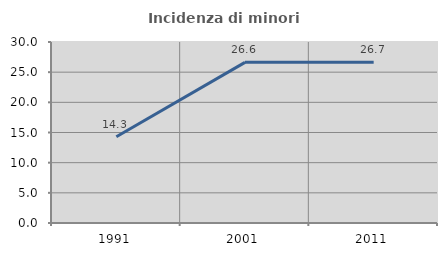
| Category | Incidenza di minori stranieri |
|---|---|
| 1991.0 | 14.286 |
| 2001.0 | 26.623 |
| 2011.0 | 26.659 |